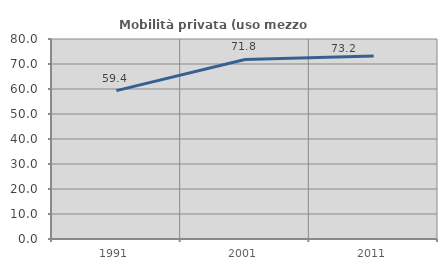
| Category | Mobilità privata (uso mezzo privato) |
|---|---|
| 1991.0 | 59.352 |
| 2001.0 | 71.832 |
| 2011.0 | 73.243 |